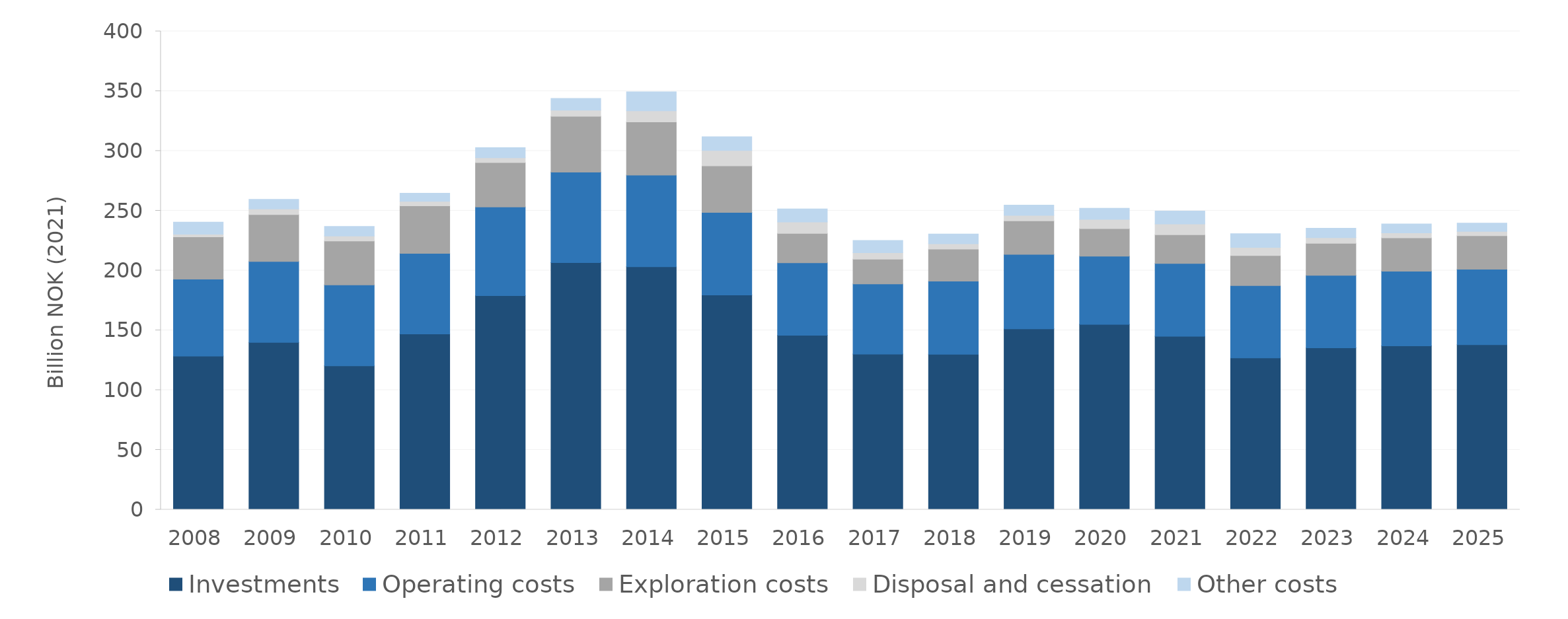
| Category | Investments | Operating costs | Exploration costs | Disposal and cessation | Other costs |
|---|---|---|---|---|---|
| 2008.0 | 128.409 | 64.383 | 35.351 | 2.207 | 10.153 |
| 2009.0 | 139.983 | 67.614 | 39.294 | 4.618 | 8.079 |
| 2010.0 | 120.345 | 67.615 | 36.825 | 4.065 | 8.097 |
| 2011.0 | 146.976 | 67.321 | 39.862 | 3.745 | 6.693 |
| 2012.0 | 179.02 | 74.199 | 37.142 | 4.024 | 8.353 |
| 2013.0 | 206.658 | 75.644 | 46.747 | 5.095 | 9.747 |
| 2014.0 | 203.243 | 76.585 | 44.54 | 9.245 | 15.857 |
| 2015.0 | 179.537 | 69.066 | 38.959 | 12.878 | 11.472 |
| 2016.0 | 145.866 | 60.624 | 24.648 | 9.507 | 10.891 |
| 2017.0 | 130.05 | 58.8 | 20.744 | 5.356 | 10.239 |
| 2018.0 | 129.979 | 61.246 | 26.729 | 4.468 | 8.125 |
| 2019.0 | 151.175 | 62.36 | 28.026 | 4.595 | 8.479 |
| 2020.0 | 154.907 | 57.049 | 23.183 | 7.651 | 9.213 |
| 2021.0 | 145.027 | 60.862 | 24.016 | 9.107 | 10.685 |
| 2022.0 | 126.974 | 60.44 | 25.128 | 6.817 | 11.492 |
| 2023.0 | 135.317 | 60.661 | 26.75 | 4.709 | 7.991 |
| 2024.0 | 137.035 | 62.349 | 27.915 | 4.17 | 7.418 |
| 2025.0 | 138.038 | 63.018 | 28.145 | 3.548 | 6.935 |